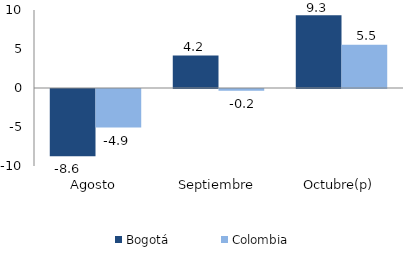
| Category | Bogotá | Colombia |
|---|---|---|
| Agosto | -8.633 | -4.937 |
| Septiembre | 4.154 | -0.237 |
| Octubre(p) | 9.322 | 5.535 |